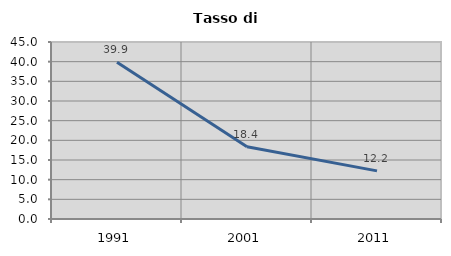
| Category | Tasso di disoccupazione   |
|---|---|
| 1991.0 | 39.869 |
| 2001.0 | 18.381 |
| 2011.0 | 12.232 |